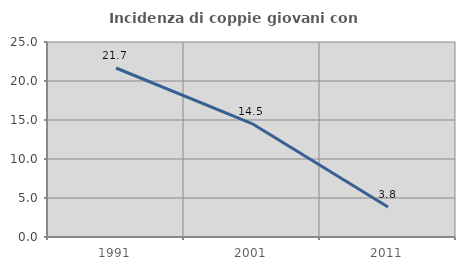
| Category | Incidenza di coppie giovani con figli |
|---|---|
| 1991.0 | 21.667 |
| 2001.0 | 14.545 |
| 2011.0 | 3.846 |